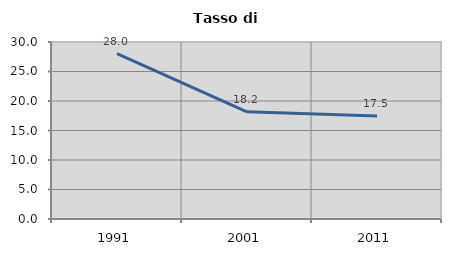
| Category | Tasso di disoccupazione   |
|---|---|
| 1991.0 | 28.028 |
| 2001.0 | 18.169 |
| 2011.0 | 17.451 |